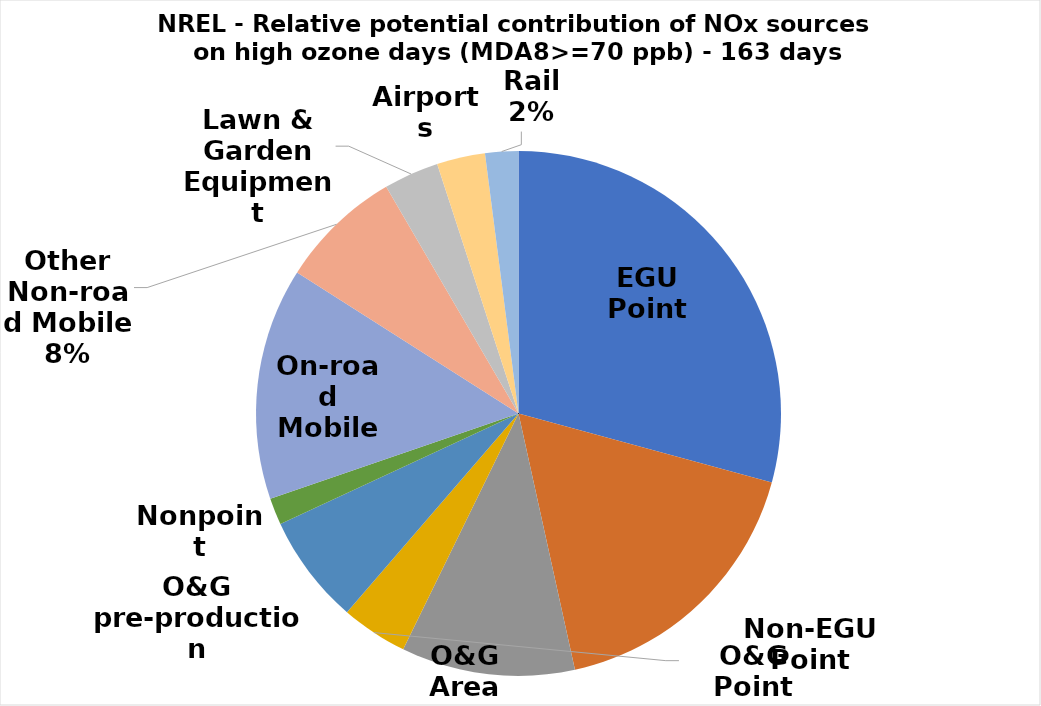
| Category | Total |
|---|---|
| EGU Point | 14541.991 |
| Non-EGU Point | 8617.414 |
| O&G Area | 5317.98 |
| O&G Point | 2037.633 |
| O&G pre-production | 3360.504 |
| Nonpoint | 816.465 |
| On-road Mobile | 7112.877 |
| Other Non-road Mobile | 3764.431 |
| Lawn & Garden Equipment | 1688.298 |
| Airports | 1479.095 |
| Rail | 1015.225 |